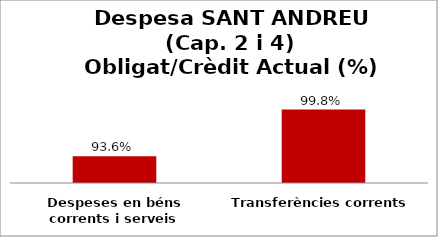
| Category | Series 0 |
|---|---|
| Despeses en béns corrents i serveis | 0.936 |
| Transferències corrents | 0.998 |